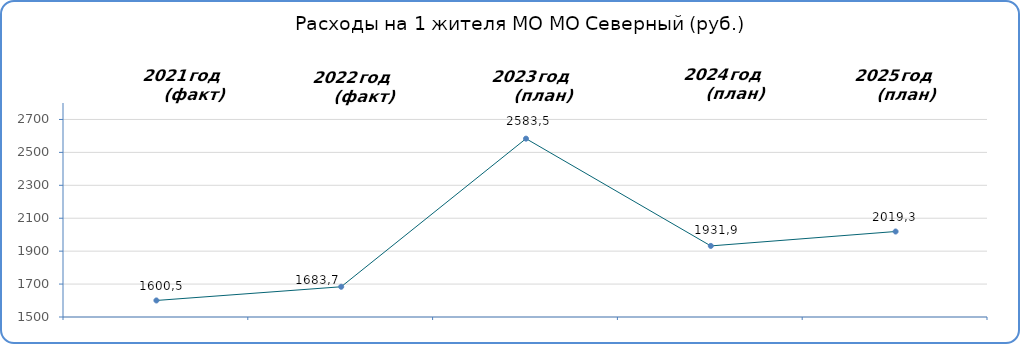
| Category | Series 0 | Series 1 | Series 2 |
|---|---|---|---|
| 2021.0 | 1600.5 |  |  |
| 2022.0 | 1683.67 |  |  |
| 2023.0 | 2583.45 |  |  |
| 2024.0 | 1931.85 |  |  |
| 2025.0 | 2019.33 |  |  |